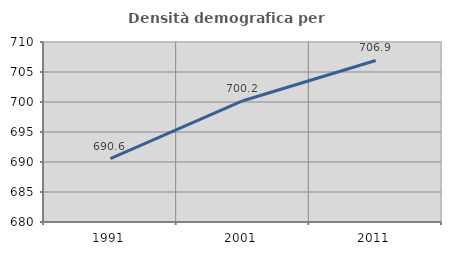
| Category | Densità demografica |
|---|---|
| 1991.0 | 690.55 |
| 2001.0 | 700.217 |
| 2011.0 | 706.922 |